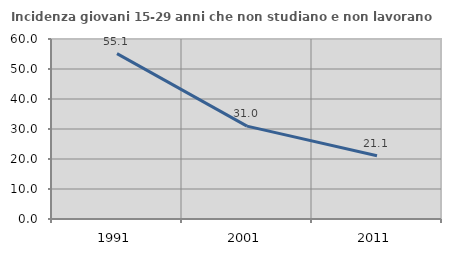
| Category | Incidenza giovani 15-29 anni che non studiano e non lavorano  |
|---|---|
| 1991.0 | 55.135 |
| 2001.0 | 30.957 |
| 2011.0 | 21.083 |